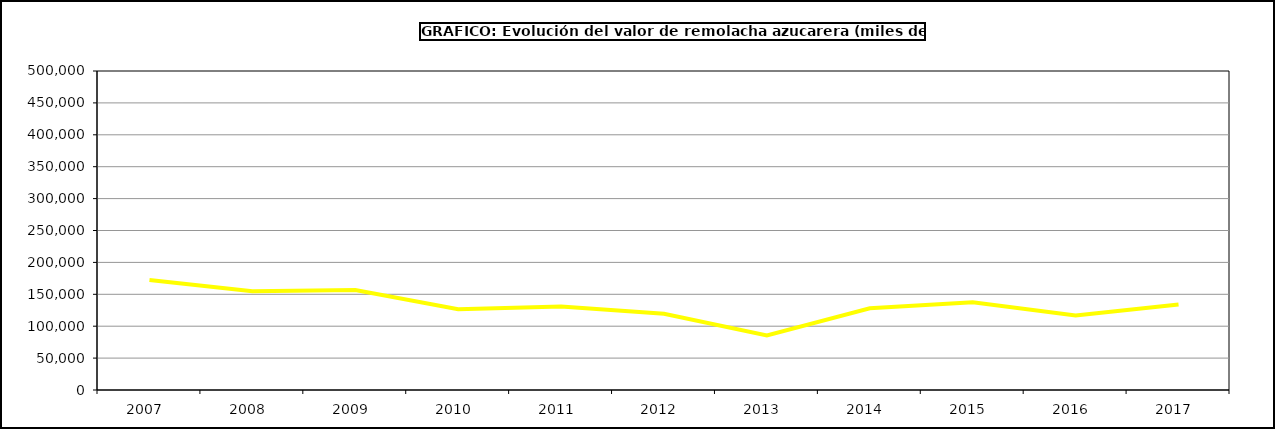
| Category | Valor |
|---|---|
| 2007.0 | 172339.526 |
| 2008.0 | 154723.398 |
| 2009.0 | 156763.564 |
| 2010.0 | 126535.709 |
| 2011.0 | 130682.292 |
| 2012.0 | 119377.935 |
| 2013.0 | 85662.388 |
| 2014.0 | 128081.83 |
| 2015.0 | 137355 |
| 2016.0 | 116654 |
| 2017.0 | 134014.925 |